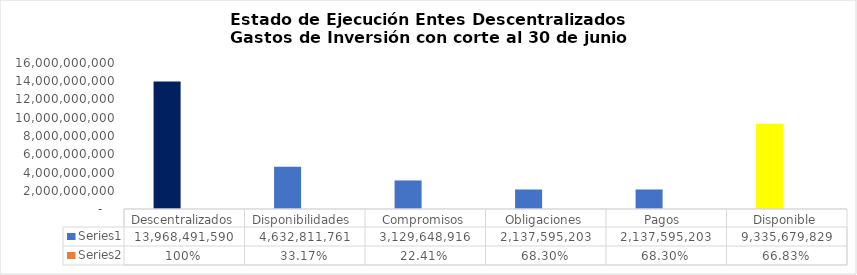
| Category | Series 0 | Series 1 |
|---|---|---|
| Descentralizados | 13968491590.13 | 1 |
| Disponibilidades  | 4632811761.44 | 0.332 |
| Compromisos | 3129648916 | 0.224 |
| Obligaciones | 2137595202.57 | 0.683 |
| Pagos  | 2137595202.57 | 0.683 |
| Disponible | 9335679828.69 | 0.668 |